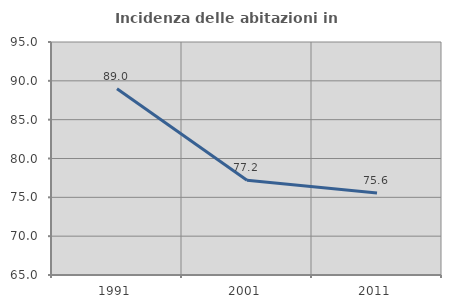
| Category | Incidenza delle abitazioni in proprietà  |
|---|---|
| 1991.0 | 88.986 |
| 2001.0 | 77.193 |
| 2011.0 | 75.551 |